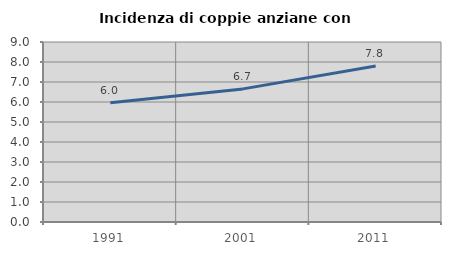
| Category | Incidenza di coppie anziane con figli |
|---|---|
| 1991.0 | 5.965 |
| 2001.0 | 6.656 |
| 2011.0 | 7.799 |